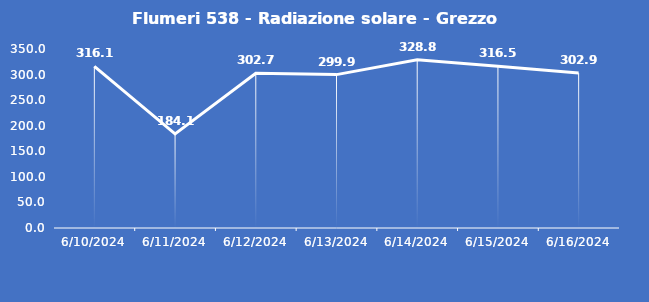
| Category | Flumeri 538 - Radiazione solare - Grezzo (W/m2) |
|---|---|
| 6/10/24 | 316.1 |
| 6/11/24 | 184.1 |
| 6/12/24 | 302.7 |
| 6/13/24 | 299.9 |
| 6/14/24 | 328.8 |
| 6/15/24 | 316.5 |
| 6/16/24 | 302.9 |